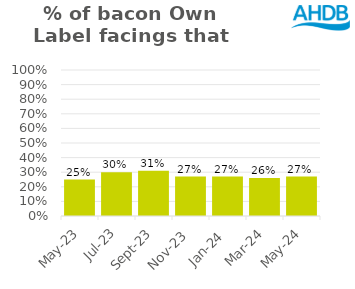
| Category | Bacon |
|---|---|
| 2023-05-01 | 0.25 |
| 2023-07-01 | 0.3 |
| 2023-09-01 | 0.31 |
| 2023-11-01 | 0.27 |
| 2024-01-01 | 0.27 |
| 2024-03-01 | 0.26 |
| 2024-05-01 | 0.27 |